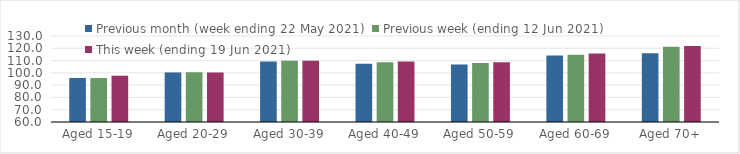
| Category | Previous month (week ending 22 May 2021) | Previous week (ending 12 Jun 2021) | This week (ending 19 Jun 2021) |
|---|---|---|---|
| Aged 15-19 | 95.82 | 95.79 | 97.7 |
| Aged 20-29 | 100.34 | 100.51 | 100.32 |
| Aged 30-39 | 109.17 | 109.9 | 109.87 |
| Aged 40-49 | 107.35 | 108.56 | 109.19 |
| Aged 50-59 | 106.75 | 108.1 | 108.73 |
| Aged 60-69 | 114.09 | 114.69 | 115.75 |
| Aged 70+ | 115.93 | 121.3 | 121.9 |